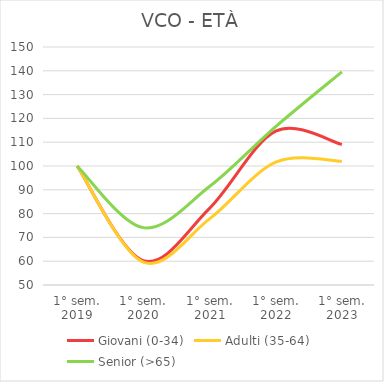
| Category | Giovani (0-34) | Adulti (35-64) | Senior (>65) |
|---|---|---|---|
| 1° sem.
2019 | 100 | 100 | 100 |
| 1° sem.
2020 | 60.236 | 59.592 | 74.101 |
| 1° sem.
2021 | 82.167 | 77.768 | 91.367 |
| 1° sem.
2022 | 114.614 | 101.616 | 116.547 |
| 1° sem.
2023 | 109.077 | 101.964 | 139.568 |